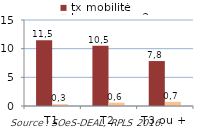
| Category | tx mobilité | tx vacance>3m |
|---|---|---|
| T1 | 11.45 | 0.31 |
| T2 | 10.49 | 0.58 |
| T3 ou + | 7.84 | 0.72 |